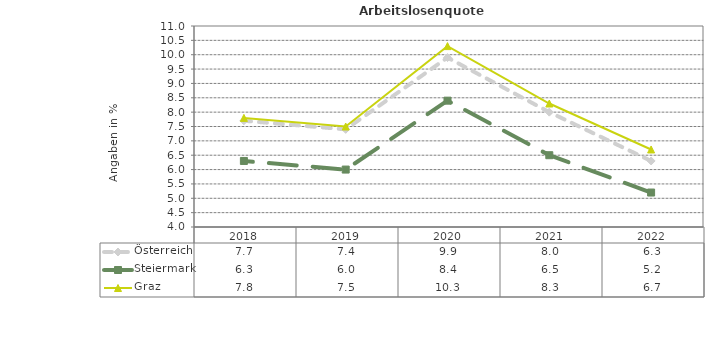
| Category | Österreich | Steiermark | Graz |
|---|---|---|---|
| 2022.0 | 6.3 | 5.2 | 6.7 |
| 2021.0 | 8 | 6.5 | 8.3 |
| 2020.0 | 9.9 | 8.4 | 10.3 |
| 2019.0 | 7.4 | 6 | 7.5 |
| 2018.0 | 7.7 | 6.3 | 7.8 |